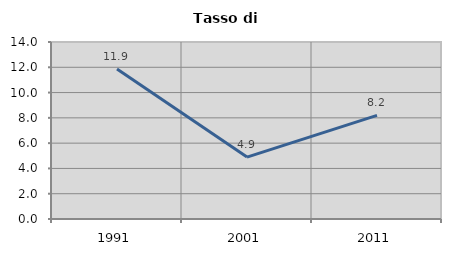
| Category | Tasso di disoccupazione   |
|---|---|
| 1991.0 | 11.864 |
| 2001.0 | 4.895 |
| 2011.0 | 8.197 |